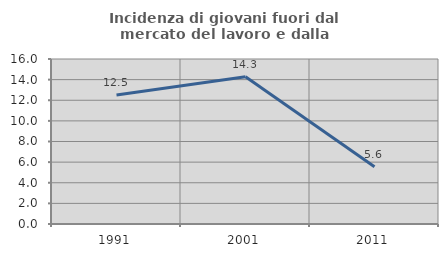
| Category | Incidenza di giovani fuori dal mercato del lavoro e dalla formazione  |
|---|---|
| 1991.0 | 12.5 |
| 2001.0 | 14.286 |
| 2011.0 | 5.556 |